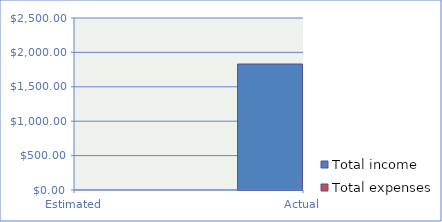
| Category | Total income | Total expenses |
|---|---|---|
| Estimated | 1936 | 0 |
| Actual | 1831 | 0 |